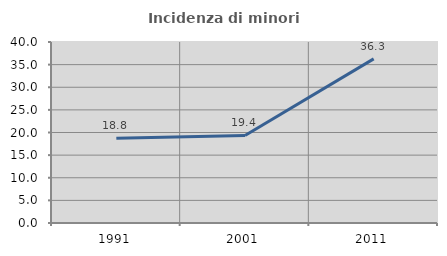
| Category | Incidenza di minori stranieri |
|---|---|
| 1991.0 | 18.75 |
| 2001.0 | 19.355 |
| 2011.0 | 36.264 |